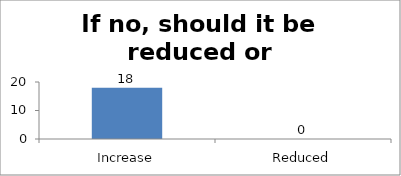
| Category | If no, should it be reduced or increased |
|---|---|
| Increase | 18 |
| Reduced | 0 |